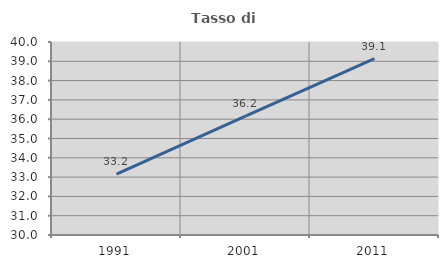
| Category | Tasso di occupazione   |
|---|---|
| 1991.0 | 33.16 |
| 2001.0 | 36.153 |
| 2011.0 | 39.137 |